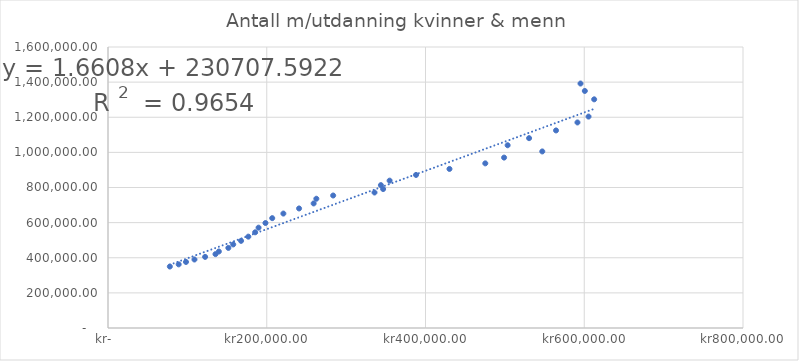
| Category | Antall m/utdanning kvinner & menn  |
|---|---|
| 77895.0 | 349982 |
| 89028.0 | 362320 |
| 98256.0 | 376078 |
| 108929.0 | 390038 |
| 122340.0 | 404868 |
| 135421.0 | 420614 |
| 139648.0 | 435562 |
| 151634.0 | 456029 |
| 157759.0 | 475805 |
| 167649.0 | 496185 |
| 176792.0 | 520180 |
| 185391.0 | 544928 |
| 189691.0 | 571272 |
| 198377.0 | 597801 |
| 206900.0 | 625470 |
| 220941.0 | 651584 |
| 240716.0 | 680681 |
| 259088.0 | 709254 |
| 262485.0 | 735973 |
| 283668.0 | 754403 |
| 335760.0 | 771497 |
| 346626.0 | 791107 |
| 343792.0 | 813514 |
| 354801.0 | 838996 |
| 388070.0 | 871561 |
| 430201.0 | 905658 |
| 475320.0 | 937418 |
| 498999.0 | 970280 |
| 547125.0 | 1005342 |
| 503487.0 | 1040555 |
| 530498.0 | 1080966 |
| 564447.0 | 1124935 |
| 591455.0 | 1170395 |
| 605408.0 | 1203812 |
| 612498.0 | 1302030 |
| 600728.0 | 1349699 |
| 595291.0 | 1391996 |